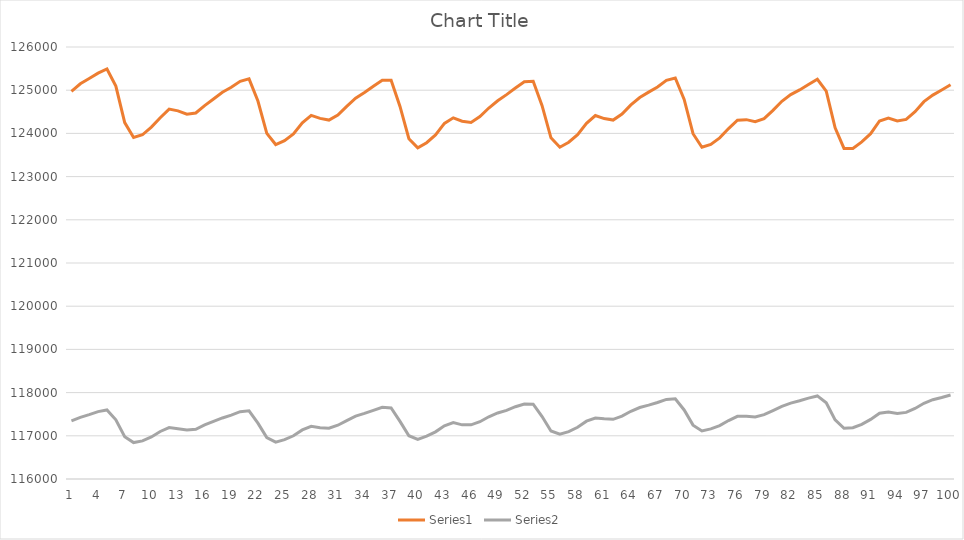
| Category | Series 1 | Series 2 |
|---|---|---|
| 0 | 124973 | 117347 |
| 1 | 125148 | 117426 |
| 2 | 125271 | 117489 |
| 3 | 125395 | 117559 |
| 4 | 125492 | 117598 |
| 5 | 125094 | 117371 |
| 6 | 124251 | 116980 |
| 7 | 123904 | 116843 |
| 8 | 123968 | 116882 |
| 9 | 124147 | 116973 |
| 10 | 124362 | 117100 |
| 11 | 124562 | 117191 |
| 12 | 124522 | 117162 |
| 13 | 124443 | 117134 |
| 14 | 124473 | 117151 |
| 15 | 124642 | 117251 |
| 16 | 124796 | 117333 |
| 17 | 124951 | 117413 |
| 18 | 125067 | 117478 |
| 19 | 125206 | 117558 |
| 20 | 125262 | 117578 |
| 21 | 124749 | 117294 |
| 22 | 124000 | 116960 |
| 23 | 123742 | 116853 |
| 24 | 123832 | 116911 |
| 25 | 123986 | 117000 |
| 26 | 124247 | 117137 |
| 27 | 124418 | 117218 |
| 28 | 124347 | 117185 |
| 29 | 124308 | 117177 |
| 30 | 124426 | 117245 |
| 31 | 124626 | 117353 |
| 32 | 124814 | 117454 |
| 33 | 124945 | 117518 |
| 34 | 125093 | 117589 |
| 35 | 125232 | 117658 |
| 36 | 125228 | 117644 |
| 37 | 124625 | 117333 |
| 38 | 123876 | 117003 |
| 39 | 123664 | 116919 |
| 40 | 123785 | 116992 |
| 41 | 123964 | 117092 |
| 42 | 124232 | 117232 |
| 43 | 124360 | 117305 |
| 44 | 124282 | 117253 |
| 45 | 124254 | 117253 |
| 46 | 124390 | 117326 |
| 47 | 124587 | 117440 |
| 48 | 124755 | 117528 |
| 49 | 124898 | 117590 |
| 50 | 125049 | 117673 |
| 51 | 125196 | 117736 |
| 52 | 125207 | 117732 |
| 53 | 124642 | 117445 |
| 54 | 123897 | 117111 |
| 55 | 123680 | 117037 |
| 56 | 123795 | 117098 |
| 57 | 123970 | 117198 |
| 58 | 124232 | 117339 |
| 59 | 124414 | 117412 |
| 60 | 124343 | 117392 |
| 61 | 124308 | 117382 |
| 62 | 124447 | 117455 |
| 63 | 124659 | 117568 |
| 64 | 124831 | 117654 |
| 65 | 124955 | 117709 |
| 66 | 125073 | 117772 |
| 67 | 125228 | 117843 |
| 68 | 125282 | 117858 |
| 69 | 124787 | 117598 |
| 70 | 123992 | 117247 |
| 71 | 123679 | 117111 |
| 72 | 123746 | 117161 |
| 73 | 123897 | 117236 |
| 74 | 124112 | 117353 |
| 75 | 124306 | 117450 |
| 76 | 124318 | 117450 |
| 77 | 124271 | 117437 |
| 78 | 124342 | 117490 |
| 79 | 124533 | 117585 |
| 80 | 124744 | 117683 |
| 81 | 124898 | 117757 |
| 82 | 125006 | 117810 |
| 83 | 125131 | 117872 |
| 84 | 125252 | 117923 |
| 85 | 124979 | 117764 |
| 86 | 124131 | 117369 |
| 87 | 123653 | 117173 |
| 88 | 123650 | 117188 |
| 89 | 123804 | 117266 |
| 90 | 123993 | 117380 |
| 91 | 124287 | 117524 |
| 92 | 124353 | 117551 |
| 93 | 124288 | 117514 |
| 94 | 124324 | 117542 |
| 95 | 124503 | 117633 |
| 96 | 124735 | 117752 |
| 97 | 124887 | 117836 |
| 98 | 125004 | 117886 |
| 99 | 125126 | 117943 |